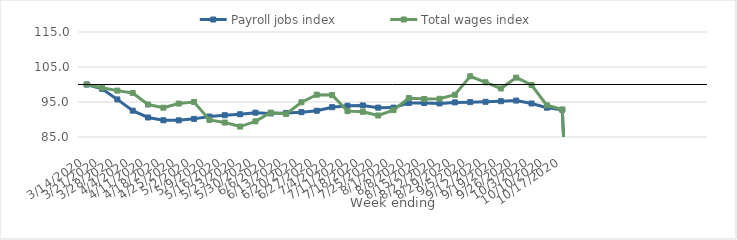
| Category | Payroll jobs index | Total wages index |
|---|---|---|
| 14/03/2020 | 100 | 100 |
| 21/03/2020 | 98.776 | 99.093 |
| 28/03/2020 | 95.739 | 98.253 |
| 04/04/2020 | 92.52 | 97.585 |
| 11/04/2020 | 90.578 | 94.27 |
| 18/04/2020 | 89.775 | 93.375 |
| 25/04/2020 | 89.761 | 94.551 |
| 02/05/2020 | 90.183 | 95.001 |
| 09/05/2020 | 90.84 | 89.893 |
| 16/05/2020 | 91.23 | 89.13 |
| 23/05/2020 | 91.497 | 87.985 |
| 30/05/2020 | 91.956 | 89.465 |
| 06/06/2020 | 91.735 | 91.98 |
| 13/06/2020 | 91.871 | 91.586 |
| 20/06/2020 | 92.094 | 94.92 |
| 27/06/2020 | 92.501 | 97.087 |
| 04/07/2020 | 93.524 | 96.98 |
| 11/07/2020 | 93.937 | 92.393 |
| 18/07/2020 | 94.019 | 92.192 |
| 25/07/2020 | 93.392 | 91.15 |
| 01/08/2020 | 93.394 | 92.675 |
| 08/08/2020 | 94.721 | 96.13 |
| 15/08/2020 | 94.714 | 95.86 |
| 22/08/2020 | 94.588 | 95.918 |
| 29/08/2020 | 94.885 | 97.069 |
| 05/09/2020 | 94.963 | 102.351 |
| 12/09/2020 | 95.061 | 100.634 |
| 19/09/2020 | 95.225 | 98.87 |
| 26/09/2020 | 95.407 | 101.97 |
| 03/10/2020 | 94.574 | 99.85 |
| 10/10/2020 | 93.376 | 94.052 |
| 17/10/2020 | 92.794 | 92.849 |